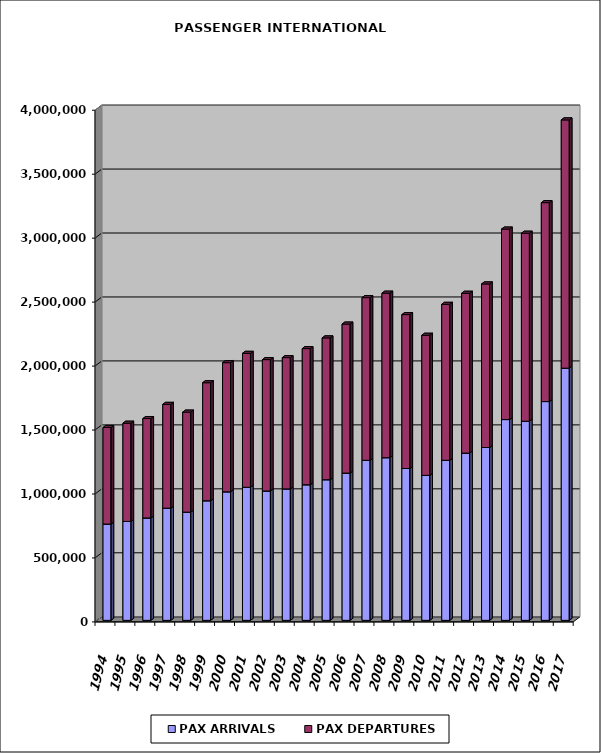
| Category | PAX ARRIVALS | PAX DEPARTURES |
|---|---|---|
| 1994.0 | 753040 | 754601 |
| 1995.0 | 773275 | 767859 |
| 1996.0 | 800500 | 777202 |
| 1997.0 | 877037 | 811393 |
| 1998.0 | 846092 | 781834 |
| 1999.0 | 935030 | 922715 |
| 2000.0 | 1005051 | 1009593 |
| 2001.0 | 1040545 | 1046908 |
| 2002.0 | 1011462 | 1026911 |
| 2003.0 | 1027767 | 1026478 |
| 2004.0 | 1060064 | 1064434 |
| 2005.0 | 1099516 | 1108560 |
| 2006.0 | 1151395 | 1164626 |
| 2007.0 | 1251308 | 1271711 |
| 2008.0 | 1271776 | 1285900 |
| 2009.0 | 1187233 | 1203072 |
| 2010.0 | 1133704 | 1094976 |
| 2011.0 | 1251433 | 1219070 |
| 2012.0 | 1307537 | 1249551 |
| 2013.0 | 1351378 | 1278590 |
| 2014.0 | 1569814 | 1488894 |
| 2015.0 | 1556788 | 1469732 |
| 2016.0 | 1710606 | 1554997 |
| 2017.0 | 1971612 | 1940763 |